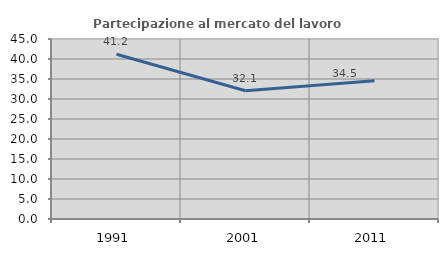
| Category | Partecipazione al mercato del lavoro  femminile |
|---|---|
| 1991.0 | 41.186 |
| 2001.0 | 32.071 |
| 2011.0 | 34.545 |